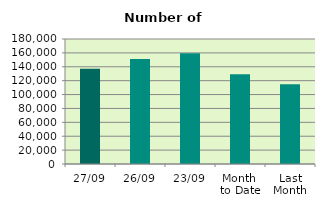
| Category | Series 0 |
|---|---|
| 27/09 | 137094 |
| 26/09 | 151230 |
| 23/09 | 159364 |
| Month 
to Date | 129378.421 |
| Last
Month | 114688 |